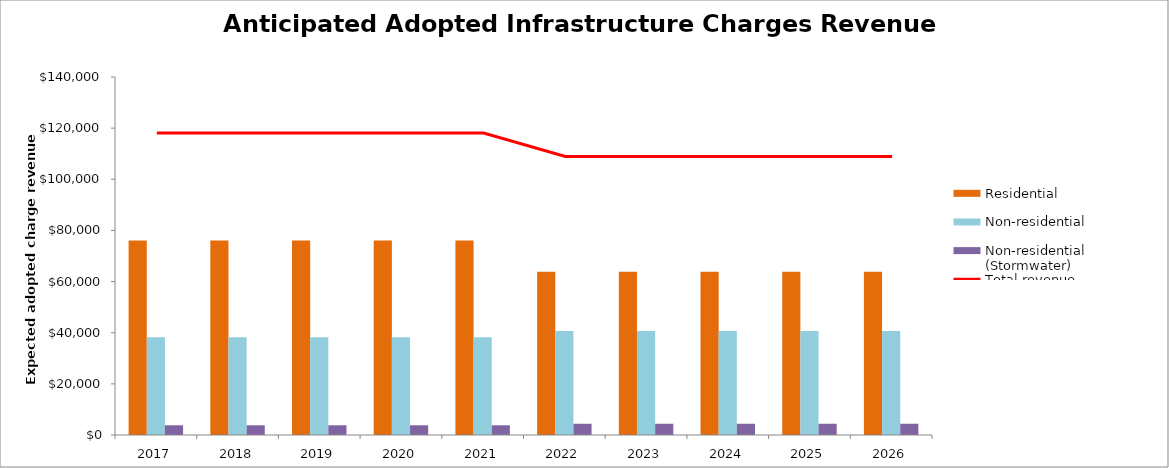
| Category | Residential | Non-residential | Non-residential (Stormwater) |
|---|---|---|---|
| 2017.0 | 76019.6 | 38274.734 | 3803.105 |
| 2018.0 | 76019.6 | 38274.734 | 3803.105 |
| 2019.0 | 76019.6 | 38274.734 | 3803.105 |
| 2020.0 | 76019.6 | 38274.734 | 3803.105 |
| 2021.0 | 76019.6 | 38274.734 | 3803.105 |
| 2022.0 | 63819.2 | 40667.287 | 4400.107 |
| 2023.0 | 63819.2 | 40667.287 | 4400.107 |
| 2024.0 | 63819.2 | 40667.287 | 4400.107 |
| 2025.0 | 63819.2 | 40667.287 | 4400.107 |
| 2026.0 | 63819.2 | 40667.287 | 4400.107 |